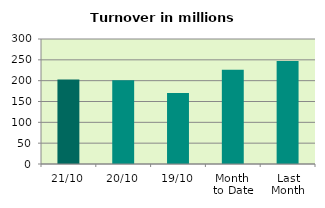
| Category | Series 0 |
|---|---|
| 21/10 | 202.996 |
| 20/10 | 200.816 |
| 19/10 | 170.679 |
| Month 
to Date | 226.188 |
| Last
Month | 247.353 |